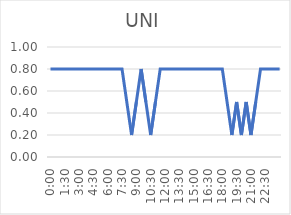
| Category | Series 0 |
|---|---|
| 0.0 | 0.8 |
| 0.020833333333333332 | 0.8 |
| 0.041666666666666664 | 0.8 |
| 0.0625 | 0.8 |
| 0.08333333333333333 | 0.8 |
| 0.10416666666666667 | 0.8 |
| 0.125 | 0.8 |
| 0.14583333333333334 | 0.8 |
| 0.16666666666666666 | 0.8 |
| 0.1875 | 0.8 |
| 0.20833333333333334 | 0.8 |
| 0.22916666666666666 | 0.8 |
| 0.25 | 0.8 |
| 0.2708333333333333 | 0.8 |
| 0.2916666666666667 | 0.8 |
| 0.3125 | 0.8 |
| 0.3333333333333333 | 0.5 |
| 0.3541666666666667 | 0.2 |
| 0.375 | 0.5 |
| 0.3958333333333333 | 0.8 |
| 0.4166666666666667 | 0.5 |
| 0.4375 | 0.2 |
| 0.4583333333333333 | 0.5 |
| 0.4791666666666667 | 0.8 |
| 0.5 | 0.8 |
| 0.5208333333333334 | 0.8 |
| 0.5416666666666666 | 0.8 |
| 0.5625 | 0.8 |
| 0.5833333333333334 | 0.8 |
| 0.6041666666666666 | 0.8 |
| 0.625 | 0.8 |
| 0.6458333333333334 | 0.8 |
| 0.6666666666666666 | 0.8 |
| 0.6875 | 0.8 |
| 0.7083333333333334 | 0.8 |
| 0.7291666666666666 | 0.8 |
| 0.75 | 0.8 |
| 0.7708333333333334 | 0.5 |
| 0.7916666666666666 | 0.2 |
| 0.8125 | 0.5 |
| 0.8333333333333334 | 0.2 |
| 0.8541666666666666 | 0.5 |
| 0.875 | 0.2 |
| 0.8958333333333334 | 0.5 |
| 0.9166666666666666 | 0.8 |
| 0.9375 | 0.8 |
| 0.9583333333333334 | 0.8 |
| 0.9791666666666666 | 0.8 |